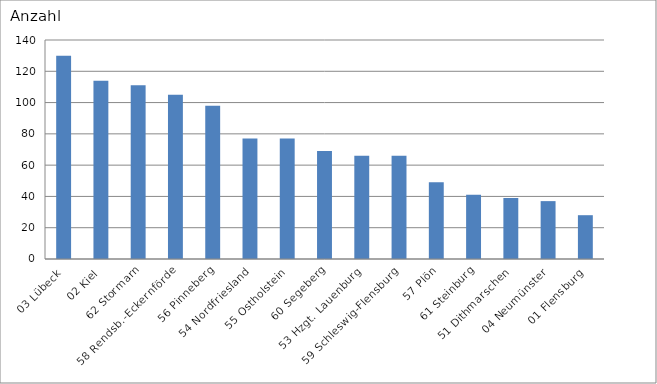
| Category | 03 Lübeck |
|---|---|
| 03 Lübeck | 130 |
| 02 Kiel | 114 |
| 62 Stormarn | 111 |
| 58 Rendsb.-Eckernförde | 105 |
| 56 Pinneberg | 98 |
| 54 Nordfriesland | 77 |
| 55 Ostholstein | 77 |
| 60 Segeberg | 69 |
| 53 Hzgt. Lauenburg | 66 |
| 59 Schleswig-Flensburg | 66 |
| 57 Plön | 49 |
| 61 Steinburg | 41 |
| 51 Dithmarschen | 39 |
| 04 Neumünster | 37 |
| 01 Flensburg | 28 |